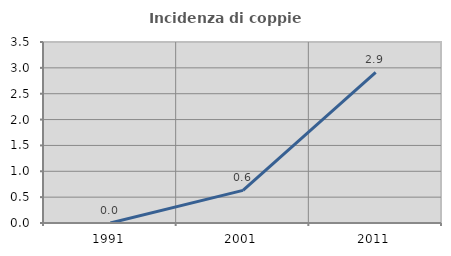
| Category | Incidenza di coppie miste |
|---|---|
| 1991.0 | 0 |
| 2001.0 | 0.631 |
| 2011.0 | 2.913 |